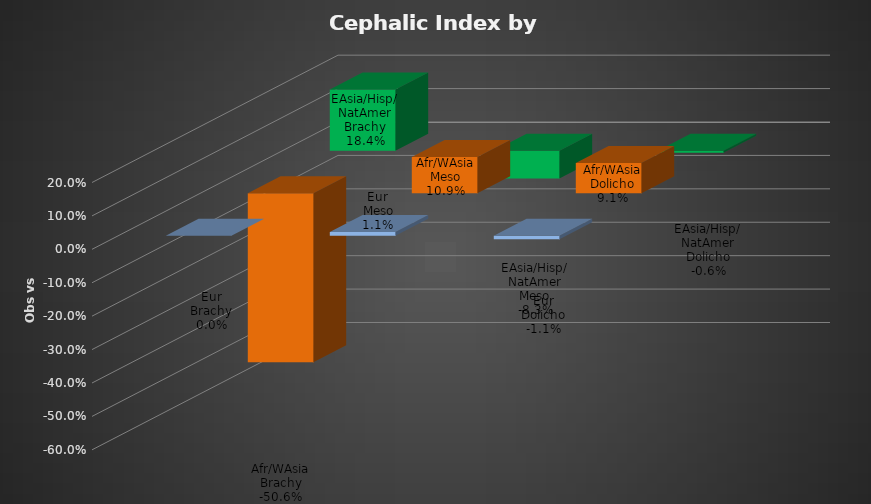
| Category | Eur | Afr/WAsia | EAsia/Hisp/NatAmer |
|---|---|---|---|
| Brachy | 0 | -0.506 | 0.184 |
| Meso | 0.011 | 0.109 | -0.083 |
| Dolicho | -0.011 | 0.091 | -0.006 |